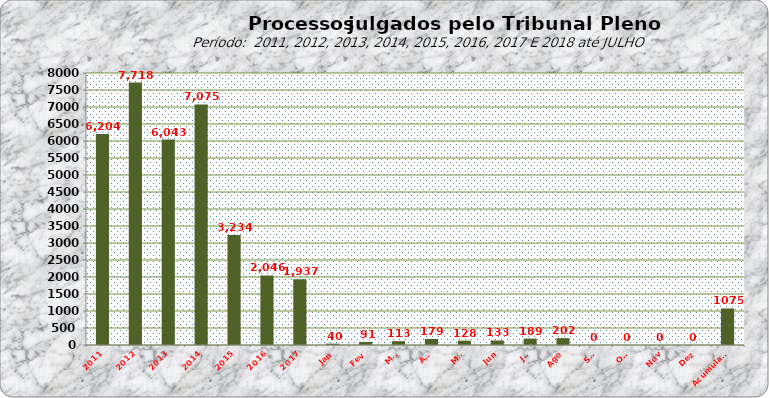
| Category | Series 0 |
|---|---|
| 2011 | 6204 |
| 2012 | 7718 |
| 2013 | 6043 |
| 2014 | 7075 |
| 2015 | 3234 |
| 2016 | 2046 |
| 2017 | 1937 |
| Jan | 40 |
| Fev | 91 |
| Mar | 113 |
| Abr | 179 |
| Mai | 128 |
| Jun | 133 |
| Jul | 189 |
| Ago | 202 |
| Set | 0 |
| Out | 0 |
| Nov | 0 |
| Dez | 0 |
| Acumulado | 1075 |